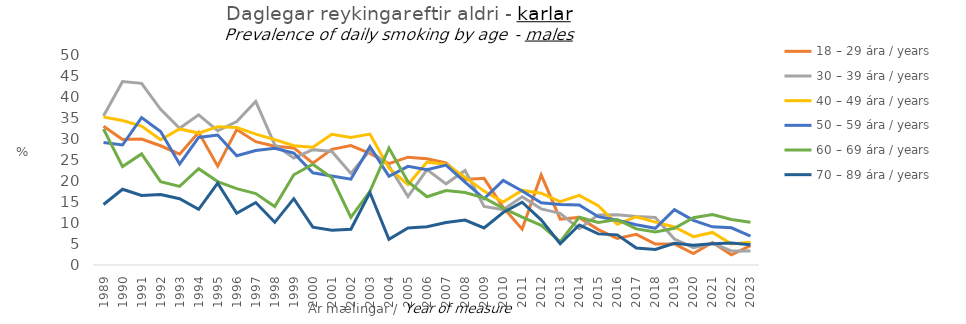
| Category | 18 – 29 ára / years | 30 – 39 ára / years | 40 – 49 ára / years | 50 – 59 ára / years | 60 – 69 ára / years | 70 – 89 ára / years |
|---|---|---|---|---|---|---|
| 1989.0 | 33.017 | 35.484 | 35.227 | 29.189 | 32.386 | 14.407 |
| 1990.0 | 29.882 | 43.681 | 34.387 | 28.571 | 23.429 | 18.033 |
| 1991.0 | 29.974 | 43.26 | 33.091 | 35.088 | 26.452 | 16.541 |
| 1992.0 | 28.392 | 37.079 | 29.811 | 31.765 | 19.858 | 16.794 |
| 1993.0 | 26.396 | 32.565 | 32.394 | 24.026 | 18.713 | 15.789 |
| 1994.0 | 31.606 | 35.766 | 31.408 | 30.357 | 22.917 | 13.245 |
| 1995.0 | 23.529 | 31.959 | 32.937 | 30.942 | 19.863 | 19.497 |
| 1996.0 | 32.239 | 34.138 | 32.734 | 26.012 | 18.182 | 12.329 |
| 1997.0 | 29.355 | 38.947 | 31.154 | 27.273 | 17.007 | 14.876 |
| 1998.0 | 28.28 | 28.622 | 29.845 | 27.811 | 13.913 | 10.156 |
| 1999.0 | 27.875 | 25.475 | 28.395 | 26.667 | 21.488 | 15.789 |
| 2000.0 | 24.242 | 27.468 | 28.03 | 21.951 | 24 | 9.016 |
| 2001.0 | 27.545 | 27.016 | 31.12 | 21.196 | 20.755 | 8.271 |
| 2002.0 | 28.421 | 21.778 | 30.357 | 20.43 | 11.321 | 8.527 |
| 2003.0 | 26.552 | 27.273 | 31.163 | 28.205 | 17.544 | 17.273 |
| 2004.0 | 24.125 | 23.581 | 23.077 | 21.106 | 27.826 | 6.14 |
| 2005.0 | 25.676 | 16.292 | 19.149 | 23.497 | 19.835 | 8.8 |
| 2006.0 | 25.301 | 22.727 | 24.49 | 22.68 | 16.26 | 9.091 |
| 2007.0 | 24.289 | 19.322 | 24.013 | 23.776 | 17.722 | 10.112 |
| 2008.0 | 20.339 | 22.491 | 20.882 | 19.723 | 17.277 | 10.714 |
| 2009.0 | 20.642 | 13.953 | 17.593 | 15.764 | 15.976 | 8.824 |
| 2010.0 | 13.754 | 13.176 | 14.983 | 20.152 | 13.542 | 12.5 |
| 2011.0 | 8.537 | 16.242 | 17.763 | 17.627 | 11.386 | 14.943 |
| 2012.0 | 21.453 | 13.362 | 17.094 | 14.815 | 9.444 | 10.753 |
| 2013.0 | 10.922 | 12.308 | 15.086 | 14.407 | 5.556 | 5.072 |
| 2014.0 | 11.336 | 8.658 | 16.592 | 14.286 | 11.374 | 9.524 |
| 2015.0 | 8.438 | 11.927 | 14.126 | 11.511 | 10.15 | 7.407 |
| 2016.0 | 6.303 | 11.959 | 9.711 | 10.638 | 10.826 | 7.173 |
| 2017.0 | 7.299 | 11.557 | 11.497 | 9.572 | 8.602 | 4.036 |
| 2018.0 | 5 | 11.312 | 10.215 | 8.728 | 7.865 | 3.704 |
| 2019.0 | 5.029 | 6.168 | 9.05 | 13.163 | 8.755 | 5.185 |
| 2020.0 | 2.744 | 4.139 | 6.744 | 10.636 | 11.271 | 4.724 |
| 2021.0 | 5.382 | 5.134 | 7.749 | 9.091 | 12 | 5.079 |
| 2022.0 | 2.434 | 3.344 | 5.005 | 8.844 | 10.832 | 5.226 |
| 2023.0 | 4.621 | 3.33 | 5.396 | 6.904 | 10.164 | 4.795 |